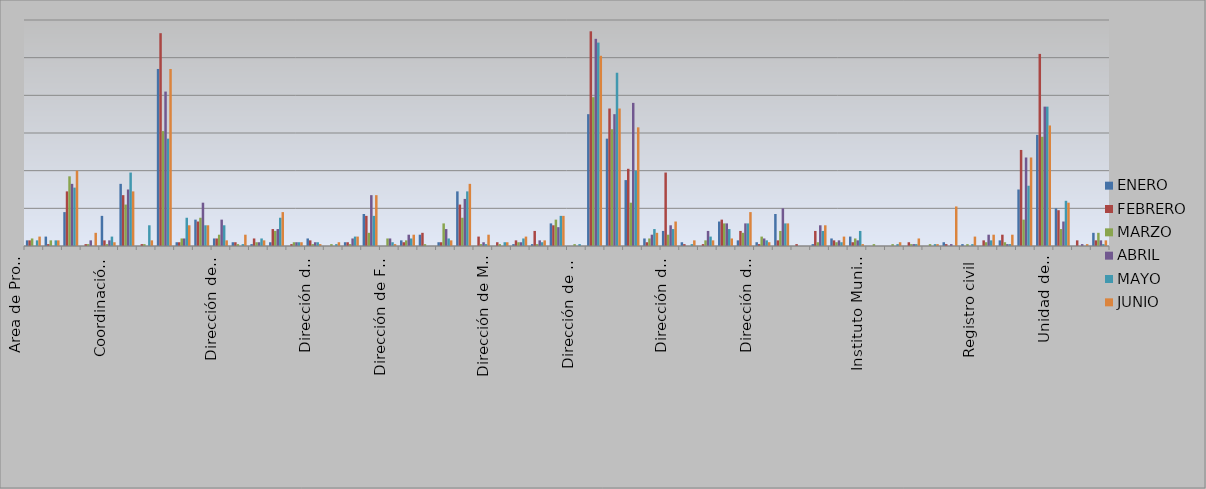
| Category | ENERO | FEBRERO | MARZO | ABRIL | MAYO | JUNIO |
|---|---|---|---|---|---|---|
| Area de Proyectos Estratégicos | 3 | 3 | 4 | 0 | 3 | 5 |
| Área de Relaciones Públicas | 5 | 1 | 3 | 0 | 3 | 3 |
| Comisaria de Seguridad Pública | 18 | 29 | 37 | 33 | 31 | 40 |
| Comunicación Social y Analisis Estratégico  | 0 | 1 | 1 | 3 | 0 | 7 |
| Contraloría Ciudadana | 16 | 3 | 1 | 3 | 5 | 2 |
| Coordinación General de Servicios Municipales | 33 | 27 | 22 | 30 | 39 | 29 |
| Coordinación de Desarrollo Económico Y Combate a la Desigualdad | 0 | 1 | 1 | 0 | 11 | 3 |
| Coordinación General de Administración e Innovación Gubernamental | 94 | 113 | 61 | 82 | 57 | 94 |
| Dirección de Alumbrado Público | 2 | 2 | 4 | 4 | 15 | 11 |
| Dirección de Archivo General Municipal  | 14 | 13 | 15 | 23 | 11 | 11 |
| Dirección de Aseo Público  | 4 | 4 | 6 | 14 | 11 | 3 |
| Dirección de Asuntos Internos | 2 | 2 | 1 | 0 | 1 | 6 |
| Dirección de Atención Ciudadana | 1 | 4 | 2 | 2 | 4 | 3 |
| Dirección de Catastro | 2 | 9 | 8 | 9 | 15 | 18 |
| Dirección de Cementerios | 0 | 1 | 2 | 2 | 2 | 2 |
| Dirección de Coplademun | 4 | 3 | 1 | 2 | 2 | 1 |
| Unidad Desarrollo Agropecuario | 0 | 0 | 1 | 0 | 1 | 2 |
| Dirección de Educación  | 2 | 2 | 1 | 4 | 5 | 5 |
| Dirección de Enlace con el ayuntamiento | 17 | 16 | 7 | 27 | 16 | 27 |
| Direccción de Delegaciones y Agencias Municipales | 0 | 0 | 4 | 4 | 2 | 1 |
| Dirección de Fomento al empleo y  emprendurismo         | 3 | 2 | 3 | 6 | 4 | 6 |
| Dirección de Gestión de calidad | 6 | 7 | 1 | 0 | 0 | 0 |
| Dirección de Gestión Integral del Agua y Drenaje | 2 | 2 | 12 | 9 | 4 | 3 |
| Dirección de Inspección y Vigilancia | 29 | 22 | 15 | 25 | 29 | 33 |
| Dirección de Integración y Dictaminación | 0 | 5 | 1 | 2 | 1 | 6 |
| Dirección de Mantenimiento de Pavimentos  | 0 | 2 | 1 | 0 | 2 | 2 |
| Dirección de Mejoramiento Urbano | 1 | 3 | 2 | 2 | 4 | 5 |
| Dirección de Mercados  | 1 | 8 | 1 | 3 | 2 | 3 |
| Dirección  de Movilidad y Transporte | 12 | 11 | 14 | 10 | 16 | 16 |
| Dirección del Museo de Arte de Zapopan | 0 | 0 | 1 | 0 | 1 | 0 |
| Dirección de Obras Públicas e Infraestructura | 70 | 114 | 79 | 110 | 108 | 101 |
| Dirección de Ordenamiento del Territorio  | 57 | 73 | 62 | 70 | 92 | 73 |
| Dirección de padrón y Licencias  | 35 | 41 | 23 | 76 | 40 | 63 |
| Dirección de Parques y Jardines  | 4 | 2 | 4 | 6 | 9 | 7 |
| Dirección de Participación Ciudadana | 8 | 39 | 6 | 11 | 9 | 13 |
| Dirección de Programas Sociales Municipales | 2 | 1 | 0 | 0 | 1 | 3 |
| Dirección de Programas Sociales y Estratégicos | 0 | 1 | 3 | 8 | 5 | 3 |
| Dirección de Protección al Medio Ambiente  | 13 | 14 | 12 | 12 | 9 | 4 |
| Dirección de Protección Civil y Bomberos | 3 | 8 | 7 | 12 | 12 | 18 |
| Dirección de Rastros Municipales  | 2 | 1 | 5 | 4 | 3 | 2 |
| Dirección de Tianguis y Comercio en espacios Abiertos | 17 | 3 | 8 | 20 | 12 | 12 |
| Dirección General de Ecología | 0 | 1 | 0 | 0 | 0 | 0 |
| Dirección de Transparencia y Buenas Prácticas | 1 | 8 | 2 | 11 | 8 | 11 |
| Instituto de Capacitación y Oferta Educativa | 4 | 3 | 2 | 3 | 2 | 5 |
| Instituto de Cultura  | 5 | 2 | 4 | 3 | 8 | 1 |
| Instituto Municipal de la Juventud | 0 | 0 | 1 | 0 | 0 | 0 |
| Instituto Municipal de la Mujer | 0 | 0 | 1 | 0 | 1 | 2 |
| Jefatura de Gabinete | 0 | 2 | 1 | 1 | 1 | 4 |
| Junta de Reclutamiento | 0 | 0 | 1 | 0 | 1 | 1 |
| Regidor | 2 | 1 | 0 | 1 | 0 | 21 |
| Registro civil | 1 | 0 | 1 | 0 | 1 | 5 |
| Secretaría del Ayuntamiento | 0 | 3 | 2 | 6 | 3 | 6 |
| Secretaría Particular | 3 | 6 | 2 | 1 | 1 | 6 |
| Sindicatura Municipal | 30 | 51 | 14 | 47 | 32 | 47 |
| Tesorería Municipal | 59 | 102 | 58 | 74 | 74 | 64 |
| Unidad de Patrimonio Municipal  | 20 | 19 | 9 | 13 | 24 | 23 |
| Unidad de Gestión de Estacionamientos | 0 | 3 | 0 | 1 | 0 | 1 |
| Unidad de Protección  Animal  | 7 | 3 | 7 | 3 | 1 | 3 |